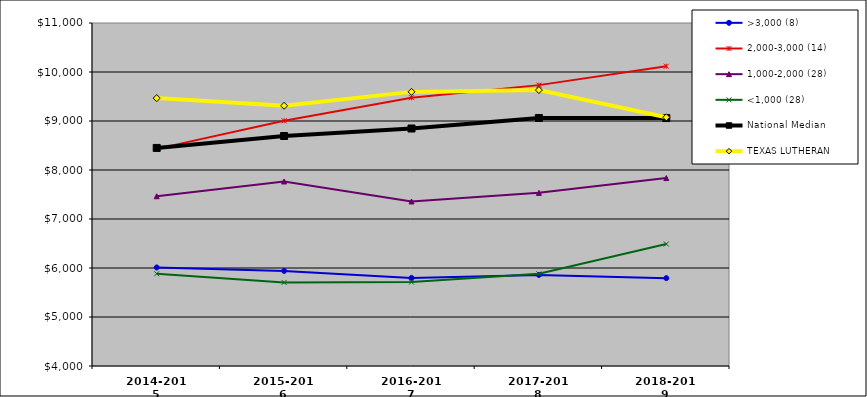
| Category | >3,000 (8) | 2,000-3,000 (14) | 1,000-2,000 (28) | <1,000 (28) | National Median | TEXAS LUTHERAN |
|---|---|---|---|---|---|---|
| 2014-2015 | 6010.712 | 8430.917 | 7464.141 | 5882.57 | 8450.558 | 9467.017 |
| 2015-2016 | 5940.606 | 9004.537 | 7765.419 | 5705.241 | 8693.909 | 9310.984 |
| 2016-2017 | 5797.748 | 9475.682 | 7357.785 | 5712.579 | 8846.742 | 9594.193 |
| 2017-2018 | 5858.707 | 9732.16 | 7533.675 | 5881.799 | 9061.41 | 9631.144 |
| 2018-2019 | 5792.969 | 10117.897 | 7834.885 | 6490.14 | 9059.978 | 9075.626 |